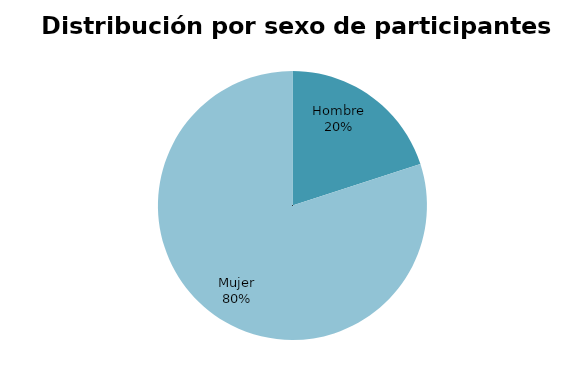
| Category | Series 0 |
|---|---|
| Hombre | 1 |
| Mujer | 4 |